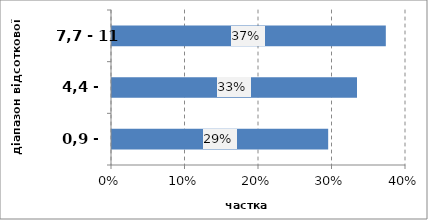
| Category | Series 0 |
|---|---|
| 0,9 - 4,3 | 0.294 |
| 4,4 - 7,6 | 0.333 |
| 7,7 - 11 | 0.373 |